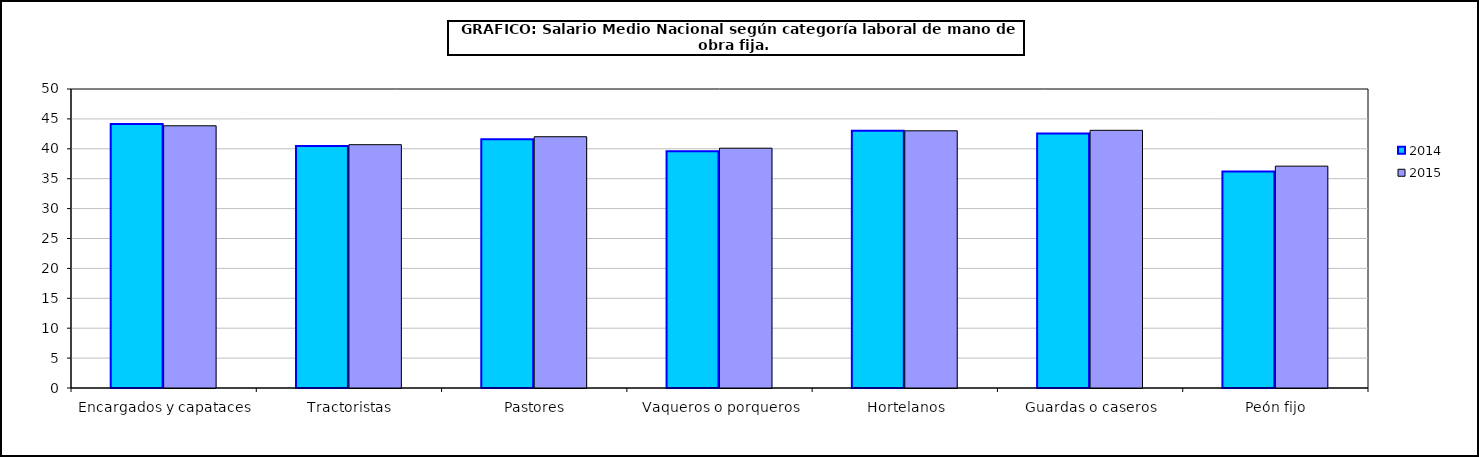
| Category | 2014 | 2015 |
|---|---|---|
|  Encargados y capataces | 44.13 | 43.85 |
|  Tractoristas | 40.47 | 40.69 |
|  Pastores | 41.6 | 42.02 |
|  Vaqueros o porqueros | 39.61 | 40.1 |
|  Hortelanos | 43.03 | 43.01 |
|  Guardas o caseros | 42.57 | 43.09 |
|  Peón fijo | 36.21 | 37.1 |